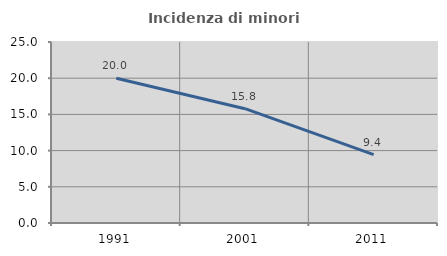
| Category | Incidenza di minori stranieri |
|---|---|
| 1991.0 | 20 |
| 2001.0 | 15.789 |
| 2011.0 | 9.434 |